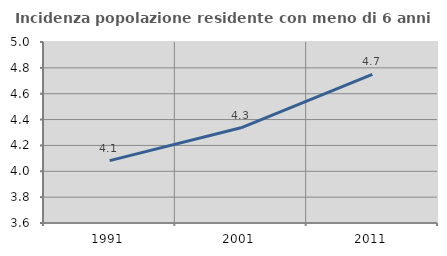
| Category | Incidenza popolazione residente con meno di 6 anni |
|---|---|
| 1991.0 | 4.083 |
| 2001.0 | 4.336 |
| 2011.0 | 4.749 |